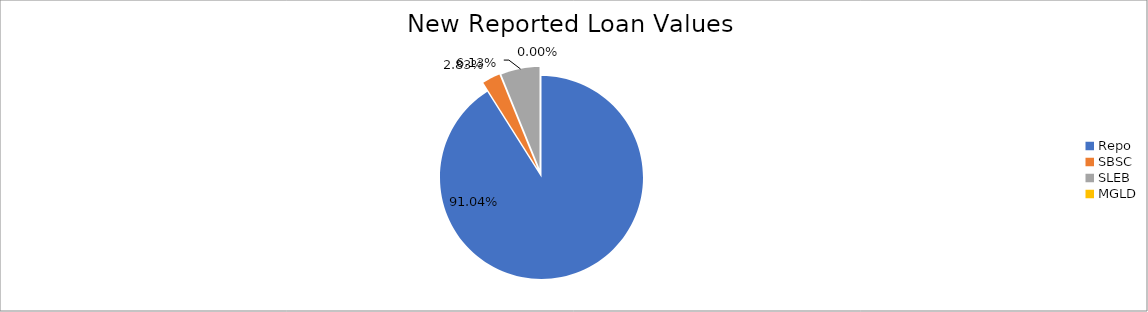
| Category | Series 0 |
|---|---|
| Repo | 8851548.959 |
| SBSC | 275614.004 |
| SLEB | 595694.459 |
| MGLD | 183.907 |